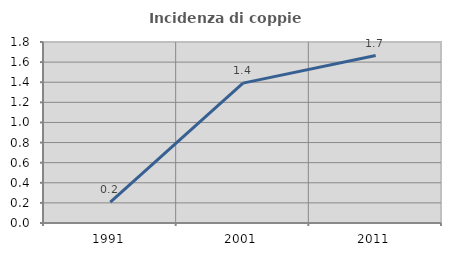
| Category | Incidenza di coppie miste |
|---|---|
| 1991.0 | 0.208 |
| 2001.0 | 1.391 |
| 2011.0 | 1.666 |